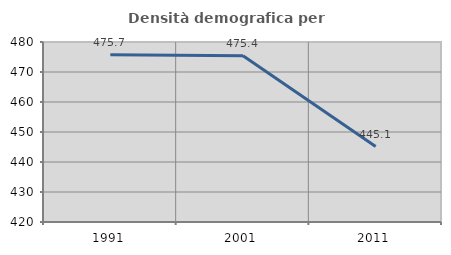
| Category | Densità demografica |
|---|---|
| 1991.0 | 475.748 |
| 2001.0 | 475.43 |
| 2011.0 | 445.149 |